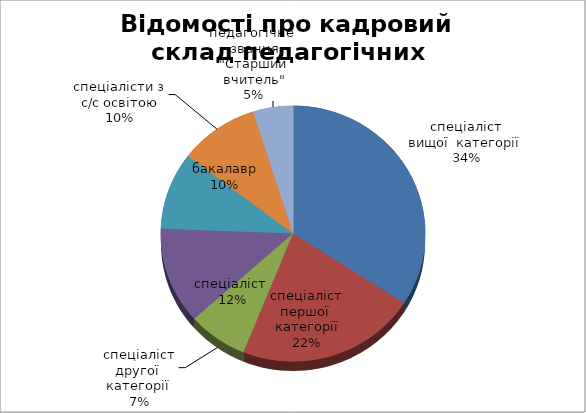
| Category | Series 0 |
|---|---|
| спеціаліст вищої  категорії  | 14 |
| спеціаліст першої  категорії | 9 |
| спеціаліст другої  категорії  | 3 |
| спеціаліст  | 5 |
| бакалавр | 4 |
| спеціалісти з с/с освітою | 4 |
| педагогічне  звання "Старший вчитель" | 2 |